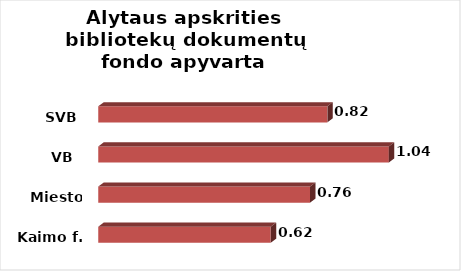
| Category | Series 0 |
|---|---|
| Kaimo f. | 0.617 |
| Miesto f. | 0.758 |
| VB  | 1.04 |
| SVB | 0.82 |